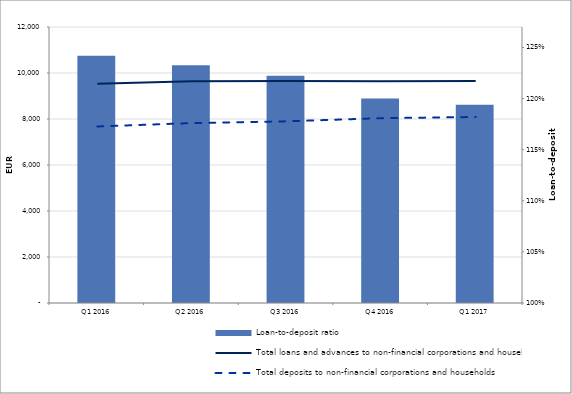
| Category | Loan-to-deposit ratio |
|---|---|
| Q1 2016 | 1.242 |
| Q2 2016 | 1.233 |
| Q3 2016 | 1.222 |
| Q4 2016 | 1.2 |
| Q1 2017 | 1.194 |